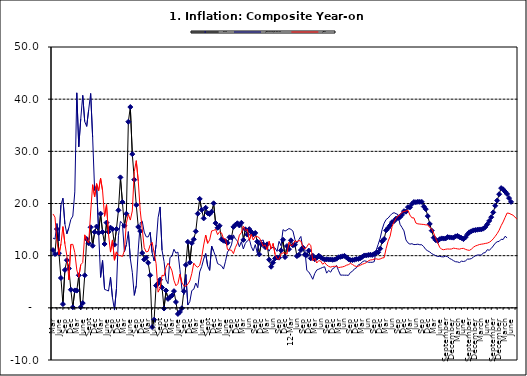
| Category | Food | All Items less Farm Produce | All Items |
|---|---|---|---|
| 09-Jan | 18.436 | 8.013 | 14.034 |
| Feb | 20.041 | 7.178 | 14.584 |
| Mar | 16.233 | 11.842 | 14.366 |
| Apr | 15.342 | 10.85 | 13.268 |
| May | 15.74 | 9.88 | 13.212 |
| June | 13.138 | 8.472 | 11.194 |
| Jul | 12.867 | 8.285 | 11.09 |
| Aug | 12.746 | 8.044 | 11.046 |
| Sep | 12.472 | 7.431 | 10.39 |
| Oct | 13.524 | 8.933 | 11.588 |
| Nov | 13.482 | 10.702 | 12.368 |
| Dec | 15.518 | 11.249 | 13.93 |
| 10-Jan | 15.918 | 12.063 | 14.398 |
| Feb | 16.208 | 13.978 | 15.649 |
| Mar | 15.79 | 13.184 | 14.812 |
| Apr | 16.306 | 12.844 | 15.044 |
| May | 13.023 | 11.711 | 12.915 |
| Jun | 15.053 | 12.686 | 14.099 |
| Jul | 14.043 | 11.287 | 13.002 |
| Aug | 15.09 | 12.366 | 13.702 |
| Sep | 14.57 | 12.83 | 13.65 |
| Oct | 14.065 | 13.168 | 13.45 |
| Nov | 14.351 | 11.746 | 12.766 |
| Dec | 12.701 | 10.917 | 11.815 |
| 11-Jan | 10.255 | 12.118 | 12.08 |
| Feb | 12.221 | 10.569 | 11.1 |
| Mar | 12.169 | 12.815 | 12.779 |
| Apr | 11.629 | 12.882 | 11.291 |
| May | 12.179 | 13.006 | 12.352 |
| Jun | 9.22 | 11.524 | 10.23 |
| Jul | 7.877 | 11.472 | 9.397 |
| Aug | 8.665 | 10.863 | 9.301 |
| Sep | 9.479 | 11.567 | 10.339 |
| Oct | 9.656 | 11.539 | 10.544 |
| Nov | 9.623 | 11.459 | 10.54 |
| Dec | 11.02 | 10.822 | 10.283 |
| 12-Jan | 13.053 | 12.748 | 12.626 |
| 12-Feb | 9.729 | 11.901 | 11.866 |
| 12-Mar | 11.848 | 14.995 | 12.111 |
| Apr | 11.246 | 14.703 | 12.866 |
| May | 12.942 | 14.926 | 12.688 |
| Jun | 11.991 | 15.199 | 12.892 |
| Jul | 12.093 | 15.045 | 12.797 |
| Aug | 9.91 | 14.714 | 11.689 |
| Sep | 10.164 | 13.101 | 11.253 |
| Oct | 11.064 | 12.398 | 11.693 |
| Nov | 11.553 | 13.092 | 12.32 |
| Dec | 10.199 | 13.685 | 11.981 |
| 13-Jan | 10.106 | 11.342 | 9.031 |
| Feb | 10.973 | 11.184 | 9.542 |
| Mar | 9.482 | 7.179 | 8.593 |
| Apr | 10.006 | 6.874 | 9.052 |
| May | 9.321 | 6.227 | 8.964 |
| Jun | 9.606 | 5.472 | 8.353 |
| Jul | 9.994 | 6.58 | 8.682 |
| Aug | 9.723 | 7.245 | 8.231 |
| Sep | 9.437 | 7.41 | 7.952 |
| Oct | 9.249 | 7.579 | 7.807 |
| Nov | 9.313 | 7.75 | 7.931 |
| Dec | 9.253 | 7.872 | 7.957 |
| 14-Jan | 9.271 | 6.648 | 7.977 |
| Feb | 9.207 | 7.166 | 7.707 |
| Mar | 9.254 | 6.836 | 7.783 |
| Apr | 9.414 | 7.508 | 7.851 |
| May | 9.698 | 7.693 | 7.965 |
| Jun | 9.776 | 8.122 | 8.167 |
| Jul | 9.878 | 7.116 | 8.281 |
| Aug | 9.959 | 6.264 | 8.534 |
| Sep | 9.676 | 6.278 | 8.317 |
| Oct | 9.343 | 6.252 | 8.06 |
| Nov | 9.144 | 6.255 | 7.927 |
| Dec | 9.152 | 6.225 | 7.978 |
| 15-Jan | 9.215 | 6.787 | 8.157 |
| Feb | 9.359 | 6.994 | 8.359 |
| Mar | 9.376 | 7.46 | 8.494 |
| Apr | 9.49 | 7.661 | 8.655 |
| May | 9.782 | 8.253 | 9.003 |
| Jun | 10.041 | 8.403 | 9.168 |
| Jul | 10.049 | 8.83 | 9.218 |
| Aug | 10.131 | 9.01 | 9.336 |
| Sep | 10.174 | 8.928 | 9.394 |
| Oct | 10.129 | 8.742 | 9.296 |
| Nov | 10.321 | 8.732 | 9.368 |
| Dec | 10.588 | 8.727 | 9.554 |
| 16-Jan | 10.642 | 8.841 | 9.617 |
| Feb | 11.348 | 11.041 | 11.379 |
| Mar | 12.745 | 12.17 | 12.775 |
| Apr | 13.194 | 13.352 | 13.721 |
| May | 14.861 | 15.054 | 15.577 |
| Jun | 15.302 | 16.224 | 16.48 |
| Jul | 15.799 | 16.929 | 17.127 |
| Aug | 16.427 | 17.208 | 17.609 |
| Sep | 16.622 | 17.666 | 17.852 |
| Oct | 17.09 | 18.067 | 18.33 |
| Nov | 17.191 | 18.241 | 18.476 |
| Dec | 17.388 | 18.052 | 18.547 |
| 17-Jan | 17.818 | 17.867 | 18.719 |
| Feb | 18.528 | 16.011 | 17.78 |
| Mar | 18.436 | 15.404 | 17.256 |
| Apr | 19.303 | 14.75 | 17.244 |
| May | 19.266 | 13.016 | 16.251 |
| Jun | 19.915 | 12.455 | 16.098 |
| Jul | 20.284 | 12.207 | 16.053 |
| Aug | 20.251 | 12.296 | 16.012 |
| Sep | 20.321 | 12.123 | 15.979 |
| Oct | 20.306 | 12.142 | 15.905 |
| Nov | 20.308 | 12.206 | 15.901 |
| Dec | 19.415 | 12.089 | 15.372 |
| 18-Jan | 18.919 | 12.09 | 15.127 |
| Feb | 17.588 | 11.707 | 14.33 |
| Mar | 16.08 | 11.181 | 13.337 |
| Apr | 14.799 | 10.92 | 12.482 |
| May | 13.448 | 10.71 | 11.608 |
| June | 12.977 | 10.387 | 11.231 |
| July | 12.85 | 10.183 | 11.142 |
| August | 13.158 | 10.015 | 11.227 |
| September | 13.309 | 9.838 | 11.284 |
| October | 13.277 | 9.882 | 11.259 |
| November | 13.301 | 9.787 | 11.281 |
| December | 13.559 | 9.771 | 11.442 |
| January | 13.505 | 9.91 | 11.374 |
| February | 13.473 | 9.8 | 11.306 |
| March | 13.451 | 9.461 | 11.251 |
| April | 13.701 | 9.28 | 11.372 |
| May | 13.794 | 9.033 | 11.396 |
| June | 13.558 | 8.841 | 11.217 |
| July | 13.392 | 8.798 | 11.084 |
| August | 13.17 | 8.678 | 11.016 |
| September | 13.507 | 8.945 | 11.244 |
| October | 14.088 | 8.876 | 11.607 |
| November | 14.482 | 8.993 | 11.854 |
| December | 14.667 | 9.331 | 11.982 |
| January | 14.849 | 9.349 | 12.132 |
| February | 14.904 | 9.434 | 12.199 |
| March | 14.977 | 9.732 | 12.257 |
| April | 15.026 | 9.979 | 12.341 |
| May | 15.036 | 10.12 | 12.404 |
| June | 15.175 | 10.128 | 12.559 |
| July | 15.482 | 10.102 | 12.821 |
| August | 15.996 | 10.521 | 13.22 |
| September | 16.66 | 10.581 | 13.707 |
| October | 17.378 | 11.137 | 14.233 |
| November | 18.298 | 11.05 | 14.887 |
| December | 19.562 | 11.374 | 15.753 |
| January | 20.567 | 11.854 | 16.466 |
| February | 21.786 | 12.382 | 17.335 |
| March | 22.948 | 12.673 | 18.171 |
| April | 22.719 | 12.743 | 18.117 |
| May | 22.277 | 13.145 | 17.933 |
| June | 21.829 | 13.094 | 17.751 |
| July | 21.032 | 13.72 | 17.377 |
| August | 20.303 | 13.408 | 17.009 |